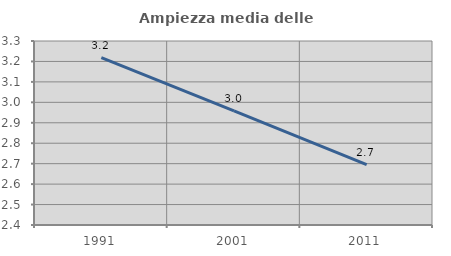
| Category | Ampiezza media delle famiglie |
|---|---|
| 1991.0 | 3.218 |
| 2001.0 | 2.959 |
| 2011.0 | 2.695 |